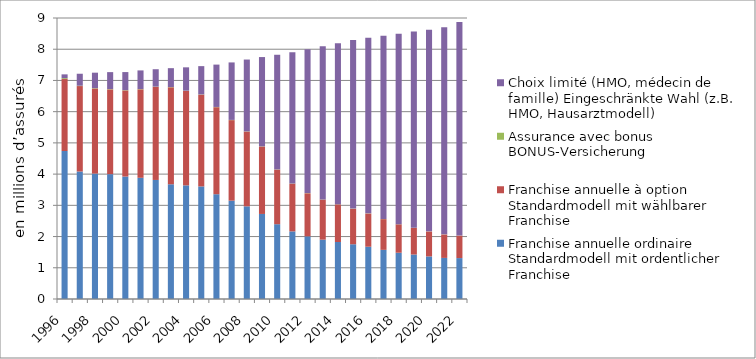
| Category | Franchise annuelle ordinaire | Franchise annuelle à option | Assurance avec bonus | Choix limité (HMO, médecin de famille) |
|---|---|---|---|---|
| 1996.0 | 4.74 | 2.306 | 0.028 | 0.122 |
| 1997.0 | 4.084 | 2.736 | 0.011 | 0.383 |
| 1998.0 | 4.016 | 2.726 | 0.012 | 0.494 |
| 1999.0 | 3.999 | 2.716 | 0.01 | 0.542 |
| 2000.0 | 3.922 | 2.759 | 0.01 | 0.578 |
| 2001.0 | 3.882 | 2.834 | 0.009 | 0.596 |
| 2002.0 | 3.813 | 2.981 | 0.009 | 0.557 |
| 2003.0 | 3.674 | 3.107 | 0.008 | 0.604 |
| 2004.0 | 3.639 | 3.025 | 0.008 | 0.748 |
| 2005.0 | 3.606 | 2.939 | 0.008 | 0.906 |
| 2006.0 | 3.356 | 2.787 | 0.007 | 1.357 |
| 2007.0 | 3.149 | 2.58 | 0.007 | 1.841 |
| 2008.0 | 2.968 | 2.394 | 0.007 | 2.3 |
| 2009.0 | 2.724 | 2.16 | 0.006 | 2.858 |
| 2010.0 | 2.395 | 1.75 | 0.006 | 3.671 |
| 2011.0 | 2.165 | 1.53 | 0.005 | 4.206 |
| 2012.0 | 2.007 | 1.379 | 0.005 | 4.608 |
| 2013.0 | 1.9 | 1.284 | 0.005 | 4.903 |
| 2014.0 | 1.825 | 1.206 | 0.005 | 5.159 |
| 2015.0 | 1.753 | 1.138 | 0.004 | 5.403 |
| 2016.0 | 1.674 | 1.065 | 0.004 | 5.625 |
| 2017.0 | 1.574 | 0.984 | 0.004 | 5.869 |
| 2018.0 | 1.482 | 0.91 | 0.004 | 6.099 |
| 2019.0 | 1.424 | 0.853 | 0.004 | 6.283 |
| 2020.0 | 1.364 | 0.799 | 0.003 | 6.457 |
| 2021.0 | 1.316 | 0.75 | 0.003 | 6.631 |
| 2022.0 | 1.31 | 0.719 | 0.003 | 6.842 |